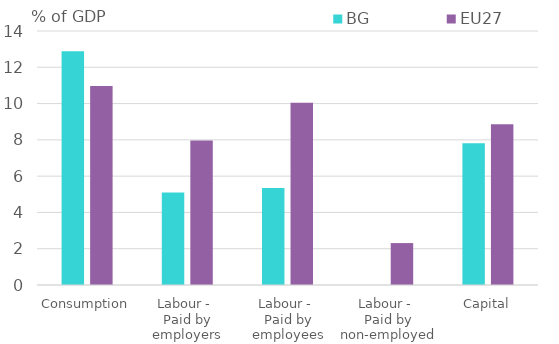
| Category | BG | EU27 |
|---|---|---|
| Consumption | 12.887 | 10.967 |
| Labour - 
Paid by employers | 5.104 | 7.966 |
| Labour - 
Paid by employees | 5.342 | 10.052 |
| Labour - 
Paid by non-employed | 0 | 2.311 |
| Capital | 7.812 | 8.858 |